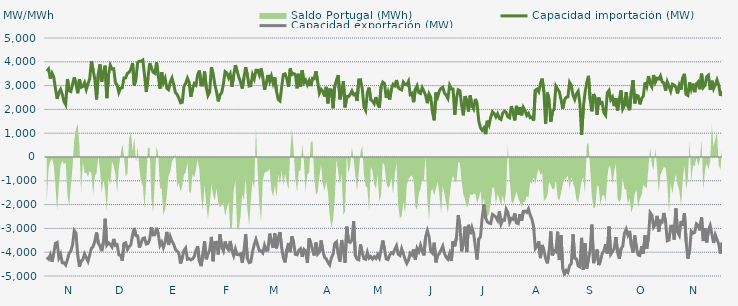
| Category | Capacidad importación (MW) | Capacidad exportación (MW) |
|---|---|---|
| 0 | 3605.625 | -4208.542 |
| 1900-01-01 | 3697.5 | -4290 |
| 1900-01-02 | 3291.25 | -4115.625 |
| 1900-01-03 | 3523.125 | -4398.75 |
| 1900-01-04 | 3371.25 | -4055.625 |
| 1900-01-05 | 2883.75 | -3628.125 |
| 1900-01-06 | 2445 | -3590.625 |
| 1900-01-07 | 2711.25 | -4233.75 |
| 1900-01-08 | 2842.292 | -4080 |
| 1900-01-09 | 2631.042 | -4443.75 |
| 1900-01-10 | 2333.542 | -4443.75 |
| 1900-01-11 | 2201.25 | -4537.5 |
| 1900-01-12 | 3275.625 | -4314.375 |
| 1900-01-13 | 2778.75 | -4038.75 |
| 1900-01-14 | 2749.167 | -3955 |
| 1900-01-15 | 3064.375 | -3696.875 |
| 1900-01-16 | 3341.083 | -3091.583 |
| 1900-01-17 | 3070.042 | -3200 |
| 1900-01-18 | 2678.625 | -4117.917 |
| 1900-01-19 | 3264.375 | -4610.625 |
| 1900-01-20 | 2928.75 | -4363.125 |
| 1900-01-21 | 2966.25 | -4316.25 |
| 1900-01-22 | 3121.875 | -4074.375 |
| 1900-01-23 | 2836.875 | -4230 |
| 1900-01-24 | 3078.75 | -4385.625 |
| 1900-01-25 | 3281.25 | -4121.25 |
| 1900-01-26 | 4027.5 | -3836.25 |
| 1900-01-27 | 3646.875 | -3765 |
| 1900-01-28 | 3256.875 | -3536.25 |
| 1900-01-29 | 2419.833 | -3170.625 |
| 1900-01-30 | 3472.5 | -3611.25 |
| 1900-01-31 | 3890.625 | -3742.5 |
| 1900-02-01 | 3166.875 | -3954.375 |
| 1900-02-02 | 3577.5 | -3583.125 |
| 1900-02-03 | 3836 | -2595.625 |
| 1900-02-04 | 2475 | -3700 |
| 1900-02-05 | 3466.875 | -3605.625 |
| 1900-02-06 | 3856.875 | -3676.458 |
| 1900-02-07 | 3697.5 | -3778.125 |
| 1900-02-08 | 3708.75 | -3440.625 |
| 1900-02-09 | 3125.625 | -3712.5 |
| 1900-02-10 | 3026.792 | -3685.625 |
| 1900-02-11 | 2711.458 | -4111.875 |
| 1900-02-12 | 2894.583 | -4117.5 |
| 1900-02-13 | 2908.583 | -4353.75 |
| 1900-02-14 | 3321.875 | -3639.375 |
| 1900-02-15 | 3324.375 | -3603.75 |
| 1900-02-16 | 3515.833 | -3886.875 |
| 1900-02-17 | 3562.5 | -3763.125 |
| 1900-02-18 | 3684.792 | -3688.125 |
| 1900-02-19 | 3950.625 | -3281.25 |
| 1900-02-20 | 3006.042 | -2979.375 |
| 1900-02-21 | 3276.667 | -3305.625 |
| 1900-02-22 | 3978.75 | -3315 |
| 1900-02-23 | 4018.125 | -3806.25 |
| 1900-02-24 | 4020 | -3611.25 |
| 1900-02-25 | 4072.5 | -3421.458 |
| 1900-02-26 | 3435 | -3400.208 |
| 1900-02-27 | 2733.458 | -3658.125 |
| 1900-02-28 | 3328.542 | -3637.5 |
| 1900-02-28 | 3937.5 | -3451.875 |
| 1900-03-01 | 3746.25 | -2948.958 |
| 1900-03-02 | 3564.375 | -3273.75 |
| 1900-03-03 | 3513.75 | -3266.25 |
| 1900-03-04 | 3975 | -2973.75 |
| 1900-03-05 | 3418.125 | -3228.75 |
| 1900-03-06 | 2868.75 | -3712.5 |
| 1900-03-07 | 3568.125 | -3577.5 |
| 1900-03-08 | 3120 | -3802.5 |
| 1900-03-09 | 3305.625 | -3564.375 |
| 1900-03-10 | 2884.375 | -3145.875 |
| 1900-03-11 | 2826.25 | -3695.625 |
| 1900-03-12 | 3149.792 | -3346.875 |
| 1900-03-13 | 3321.458 | -3540 |
| 1900-03-14 | 3048.75 | -3665.625 |
| 1900-03-15 | 2704.25 | -3881.25 |
| 1900-03-16 | 2627.25 | -3950.625 |
| 1900-03-17 | 2475.708 | -4038.75 |
| 1900-03-18 | 2277.917 | -4477.5 |
| 1900-03-19 | 2300 | -4239.375 |
| 1900-03-20 | 2972.708 | -3928.125 |
| 1900-03-21 | 3093.75 | -3825 |
| 1900-03-22 | 3313.333 | -4297.5 |
| 1900-03-23 | 3141.75 | -4268.125 |
| 1900-03-24 | 2533.125 | -4321.875 |
| 1900-03-25 | 2863.375 | -4282.5 |
| 1900-03-26 | 3088.125 | -4185 |
| 1900-03-27 | 3024.375 | -3931.875 |
| 1900-03-28 | 3459.375 | -3751.875 |
| 1900-03-29 | 3630 | -4380 |
| 1900-03-30 | 3020.625 | -4586.25 |
| 1900-03-31 | 3020.625 | -4091.25 |
| 1900-04-01 | 3592.5 | -3540 |
| 1900-04-02 | 2925 | -4297.5 |
| 1900-04-03 | 2582.625 | -4080.542 |
| 1900-04-04 | 2730 | -3900.625 |
| 1900-04-05 | 3769.167 | -3357.25 |
| 1900-04-06 | 3498.625 | -4380 |
| 1900-04-07 | 3058.125 | -3591.583 |
| 1900-04-08 | 2735.625 | -3581.875 |
| 1900-04-09 | 2339.792 | -4096.875 |
| 1900-04-10 | 2622.625 | -3250.667 |
| 1900-04-11 | 2697.5 | -3770.625 |
| 1900-04-12 | 3064.167 | -3943.625 |
| 1900-04-13 | 3588.75 | -3549.375 |
| 1900-04-14 | 3535.75 | -3810 |
| 1900-04-15 | 3333.958 | -3898.125 |
| 1900-04-16 | 3486.625 | -3530.542 |
| 1900-04-17 | 2951.375 | -3943.125 |
| 1900-04-18 | 3439.375 | -4149.375 |
| 1900-04-19 | 3860.625 | -3864.375 |
| 1900-04-20 | 3609.583 | -4100.625 |
| 1900-04-21 | 3359.75 | -4110 |
| 1900-04-22 | 3152.25 | -4073.75 |
| 1900-04-23 | 2876.25 | -4441.875 |
| 1900-04-24 | 3331.25 | -3948.75 |
| 1900-04-25 | 3768.75 | -3251.25 |
| 1900-04-26 | 3435.667 | -4269.375 |
| 1900-04-27 | 2984.167 | -4438.125 |
| 1900-04-28 | 2998.583 | -4415.625 |
| 1900-04-29 | 3457.333 | -3980.625 |
| 1900-04-30 | 3283.042 | -3676.875 |
| 1900-05-01 | 3641.25 | -3464.5 |
| 1900-05-02 | 3640.708 | -3708.75 |
| 1900-05-03 | 3435.708 | -3937.5 |
| 1900-05-04 | 3718.125 | -3943.125 |
| 1900-05-05 | 3344.458 | -4031.25 |
| 1900-05-06 | 2827.083 | -3710.625 |
| 1900-05-07 | 3113.75 | -3920.625 |
| 1900-05-08 | 3448.125 | -3913.125 |
| 1900-05-09 | 3172.083 | -3219.375 |
| 1900-05-10 | 3397.5 | -3562.5 |
| 1900-05-11 | 3101.042 | -3819.375 |
| 1900-05-12 | 3341.25 | -3215.625 |
| 1900-05-13 | 2760.833 | -3838.125 |
| 1900-05-14 | 2417.5 | -3395.625 |
| 1900-05-15 | 2354.583 | -3155.625 |
| 1900-05-16 | 2936.875 | -3811.875 |
| 1900-05-17 | 3468.75 | -4241.25 |
| 1900-05-18 | 3495 | -4426.875 |
| 1900-05-19 | 3297.083 | -3890.625 |
| 1900-05-20 | 2946.292 | -3613.125 |
| 1900-05-21 | 3714.792 | -3997.5 |
| 1900-05-22 | 3460.833 | -3331.875 |
| 1900-05-23 | 3502.917 | -3618.5 |
| 1900-05-24 | 3472.5 | -4089.375 |
| 1900-05-25 | 2885.87 | -4111.304 |
| 1900-05-26 | 3496.875 | -3930 |
| 1900-05-27 | 2942.5 | -3858.75 |
| 1900-05-28 | 3650.625 | -4194.375 |
| 1900-05-29 | 3122.458 | -3885 |
| 1900-05-30 | 3230.042 | -3961.875 |
| 1900-05-31 | 3034.208 | -4453.125 |
| 1900-06-01 | 3206.25 | -3423.75 |
| 1900-06-02 | 2977.5 | -3611.25 |
| 1900-06-03 | 3309.375 | -3911.25 |
| 1900-06-04 | 3288.75 | -4138.125 |
| 1900-06-05 | 3602.833 | -3596.25 |
| 1900-06-06 | 3174.375 | -4080 |
| 1900-06-07 | 2683.667 | -3991.875 |
| 1900-06-08 | 2848.875 | -3504.833 |
| 1900-06-09 | 2758.542 | -3938.333 |
| 1900-06-10 | 2545.417 | -4209.375 |
| 1900-06-11 | 2945.625 | -4278.75 |
| 1900-06-12 | 2252.5 | -4423.125 |
| 1900-06-13 | 2829.375 | -4533.75 |
| 1900-06-14 | 2820.917 | -4235.625 |
| 1900-06-15 | 2048.125 | -4081.208 |
| 1900-06-16 | 3003.75 | -3632.292 |
| 1900-06-17 | 3232.5 | -3565.625 |
| 1900-06-18 | 3440.625 | -4096.875 |
| 1900-06-19 | 2422.5 | -4393.125 |
| 1900-06-20 | 2763.958 | -3487.5 |
| 1900-06-21 | 3183.75 | -3943.125 |
| 1900-06-22 | 2087.083 | -4443.75 |
| 1900-06-23 | 2547 | -2925.75 |
| 1900-06-24 | 2531.667 | -3560.625 |
| 1900-06-25 | 2628.75 | -3590.625 |
| 1900-06-26 | 2778.75 | -3480 |
| 1900-06-27 | 2617.292 | -2701.792 |
| 1900-06-28 | 2655 | -4141.875 |
| 1900-06-29 | 2355.417 | -4288.125 |
| 1900-06-30 | 3240.75 | -4318.125 |
| 1900-07-01 | 3247.5 | -3676.875 |
| 1900-07-02 | 2878.042 | -4025.625 |
| 1900-07-03 | 2109.167 | -4269.375 |
| 1900-07-04 | 1961.042 | -4299.375 |
| 1900-07-05 | 2710.208 | -4003.125 |
| 1900-07-06 | 2916 | -4248.333 |
| 1900-07-07 | 2401.875 | -4179.375 |
| 1900-07-08 | 2351.25 | -4286.25 |
| 1900-07-09 | 2238.75 | -4192.5 |
| 1900-07-10 | 2520 | -4265.625 |
| 1900-07-11 | 2227.5 | -4108.125 |
| 1900-07-12 | 2070.583 | -4246.875 |
| 1900-07-13 | 2958.75 | -3892.5 |
| 1900-07-14 | 3146.25 | -3508.125 |
| 1900-07-15 | 3087.5 | -3877.5 |
| 1900-07-16 | 2487.5 | -4284.375 |
| 1900-07-17 | 2722.5 | -4310.625 |
| 1900-07-18 | 2411.25 | -4125 |
| 1900-07-19 | 2840.5 | -4025.625 |
| 1900-07-20 | 3054.5 | -4066.875 |
| 1900-07-21 | 2992.958 | -3879.375 |
| 1900-07-22 | 3232.5 | -3729.375 |
| 1900-07-23 | 2917.5 | -4085.625 |
| 1900-07-24 | 2853.75 | -4141.875 |
| 1900-07-25 | 2819.458 | -3849.375 |
| 1900-07-26 | 3145.042 | -4061.25 |
| 1900-07-27 | 3046.958 | -4290 |
| 1900-07-28 | 3028.125 | -4468.125 |
| 1900-07-29 | 3180.542 | -4331.25 |
| 1900-07-30 | 2624.958 | -4042.5 |
| 1900-07-31 | 2676.25 | -4115.625 |
| 1900-08-01 | 2302.5 | -3873.75 |
| 1900-08-02 | 2854.208 | -4308.75 |
| 1900-08-03 | 2997.833 | -3837.167 |
| 1900-08-04 | 2709.375 | -3973.125 |
| 1900-08-05 | 2670 | -3712.958 |
| 1900-08-06 | 2913.75 | -3958.125 |
| 1900-08-07 | 2765.625 | -4134.375 |
| 1900-08-08 | 2587.5 | -3352.5 |
| 1900-08-09 | 2261.25 | -3093.75 |
| 1900-08-10 | 2651.25 | -3345.208 |
| 1900-08-11 | 2510.625 | -3963.75 |
| 1900-08-12 | 1885.875 | -4044.375 |
| 1900-08-13 | 1541.5 | -3601.375 |
| 1900-08-14 | 2707.5 | -4426.875 |
| 1900-08-15 | 2516.25 | -4128.75 |
| 1900-08-16 | 2775 | -4059.375 |
| 1900-08-17 | 2883.75 | -3906.667 |
| 1900-08-18 | 2930.625 | -3742.5 |
| 1900-08-19 | 2685 | -4061.25 |
| 1900-08-20 | 2596.875 | -4213.125 |
| 1900-08-21 | 2463.75 | -4295.625 |
| 1900-08-22 | 3005.625 | -4065 |
| 1900-08-23 | 2861.25 | -4370.625 |
| 1900-08-24 | 2855.083 | -3533.583 |
| 1900-08-25 | 1775.625 | -3751.875 |
| 1900-08-26 | 2478.75 | -3391.875 |
| 1900-08-27 | 2821.875 | -2444.375 |
| 1900-08-28 | 2782.5 | -2903.75 |
| 1900-08-29 | 2169.375 | -3964.667 |
| 1900-08-30 | 1751.292 | -3614.625 |
| 1900-08-31 | 2561.25 | -2926.875 |
| 1900-09-01 | 2356.875 | -3995.625 |
| 1900-09-02 | 1911.125 | -2849.625 |
| 1900-09-03 | 2583.75 | -3240 |
| 1900-09-04 | 2157.125 | -2962.917 |
| 1900-09-05 | 2021.375 | -3195.625 |
| 1900-09-06 | 2439.375 | -3776.25 |
| 1900-09-07 | 2235 | -4305 |
| 1900-09-08 | 1509.375 | -3436.875 |
| 1900-09-09 | 1230.208 | -3360 |
| 1900-09-10 | 1123.125 | -2546.875 |
| 1900-09-11 | 1221.25 | -1995.875 |
| 1900-09-12 | 962.083 | -2563.125 |
| 1900-09-13 | 1523.958 | -2728.125 |
| 1900-09-14 | 1344.375 | -2776.875 |
| 1900-09-15 | 1676.25 | -2795.625 |
| 1900-09-16 | 1899.375 | -2411.25 |
| 1900-09-17 | 1826.25 | -2461.875 |
| 1900-09-18 | 1680 | -2529.375 |
| 1900-09-19 | 1815 | -2662.5 |
| 1900-09-20 | 1621.458 | -2287.5 |
| 1900-09-21 | 1577.083 | -2818.125 |
| 1900-09-22 | 1846.875 | -2643.75 |
| 1900-09-23 | 1923.75 | -2656.875 |
| 1900-09-24 | 1875 | -2195.625 |
| 1900-09-25 | 1683.75 | -2330.625 |
| 1900-09-26 | 1646.25 | -2746.875 |
| 1900-09-27 | 2137.5 | -2580.5 |
| 1900-09-28 | 1860 | -2620.625 |
| 1900-09-29 | 1537.5 | -2371.875 |
| 1900-09-30 | 2149.292 | -2771.25 |
| 1900-10-01 | 1766.25 | -2801.25 |
| 1900-10-02 | 2097.75 | -2405.625 |
| 1900-10-03 | 1753.125 | -2676.75 |
| 1900-10-04 | 2090.625 | -2285.292 |
| 1900-10-05 | 1956.125 | -2274.75 |
| 1900-10-06 | 1743.75 | -2330.125 |
| 1900-10-07 | 1833.75 | -2185.875 |
| 1900-10-08 | 1651.875 | -2439.375 |
| 1900-10-09 | 1677 | -2608.125 |
| 1900-10-10 | 1526.25 | -2926.875 |
| 1900-10-11 | 2806.875 | -3847.5 |
| 1900-10-12 | 2853.75 | -3770.625 |
| 1900-10-13 | 2739.375 | -3542.5 |
| 1900-10-14 | 3086.25 | -4248.75 |
| 1900-10-15 | 3294.375 | -3694.583 |
| 1900-10-16 | 2737.5 | -3914.167 |
| 1900-10-17 | 1388.958 | -4258.125 |
| 1900-10-18 | 2705.625 | -4468.125 |
| 1900-10-19 | 2414.25 | -4032.292 |
| 1900-10-20 | 1474.5 | -3127.5 |
| 1900-10-21 | 1904.833 | -4134.375 |
| 1900-10-22 | 2018.333 | -3933.75 |
| 1900-10-23 | 2978.625 | -3980.625 |
| 1900-10-24 | 2851.875 | -3137.917 |
| 1900-10-25 | 2745 | -4327.5 |
| 1900-10-26 | 2411.25 | -3294.375 |
| 1900-10-27 | 2032.5 | -4693.125 |
| 1900-10-28 | 2394.375 | -4916.25 |
| 1900-10-29 | 2506.875 | -4770 |
| 1900-10-30 | 2527.5 | -4845 |
| 1900-10-31 | 3132.875 | -4556.25 |
| 1900-11-01 | 3001.875 | -4479.375 |
| 1900-11-02 | 2597 | -3253.75 |
| 1900-11-03 | 2415.833 | -4258.125 |
| 1900-11-04 | 2655 | -4284.375 |
| 1900-11-05 | 2764.458 | -4576.875 |
| 1900-11-06 | 2248.625 | -4616.25 |
| 1900-11-07 | 931.875 | -3396.042 |
| 1900-11-08 | 2074.792 | -4740 |
| 1900-11-09 | 2707.5 | -3624.375 |
| 1900-11-10 | 3118.125 | -4681.875 |
| 1900-11-11 | 3408.75 | -4280.625 |
| 1900-11-12 | 2415 | -3889.583 |
| 1900-11-13 | 1918.917 | -2840.25 |
| 1900-11-14 | 2645.125 | -4460.625 |
| 1900-11-15 | 2469.792 | -4186.875 |
| 1900-11-16 | 1772.542 | -3887.917 |
| 1900-11-17 | 2498.667 | -4538.125 |
| 1900-11-18 | 2245.542 | -4370 |
| 1900-11-19 | 2285.625 | -4056.25 |
| 1900-11-20 | 1862.708 | -3941.667 |
| 1900-11-21 | 1755.417 | -3663.125 |
| 1900-11-22 | 2699.583 | -4063.125 |
| 1900-11-23 | 2797.5 | -2925.625 |
| 1900-11-24 | 2403.333 | -4085.625 |
| 1900-11-25 | 2516.25 | -3971.25 |
| 1900-11-26 | 2135.625 | -3854.792 |
| 1900-11-27 | 2477.125 | -3369.292 |
| 1900-11-28 | 1956.292 | -3999.375 |
| 1900-11-29 | 2427.5 | -4280 |
| 1900-11-30 | 2798 | -3856.875 |
| 1900-12-01 | 2018.125 | -3744.583 |
| 1900-12-02 | 2168.958 | -3208.75 |
| 1900-12-03 | 2728.125 | -3034.375 |
| 1900-12-04 | 2131.75 | -3278.125 |
| 1900-12-05 | 1966.875 | -3106.458 |
| 1900-12-06 | 2738.083 | -3703.375 |
| 1900-12-07 | 3229.167 | -4012.5 |
| 1900-12-08 | 2249.792 | -3300.833 |
| 1900-12-09 | 2592.917 | -3809.792 |
| 1900-12-10 | 2566.25 | -4116.667 |
| 1900-12-11 | 2212.5 | -4138.708 |
| 1900-12-12 | 2464.375 | -3755.833 |
| 1900-12-13 | 2551.042 | -4061.25 |
| 1900-12-14 | 3133.5 | -3295.833 |
| 1900-12-15 | 2953.75 | -3854.167 |
| 1900-12-16 | 3401.25 | -3375.917 |
| 1900-12-17 | 3082.5 | -2336.25 |
| 1900-12-18 | 2949.375 | -2439.375 |
| 1900-12-19 | 3446.25 | -2947.5 |
| 1900-12-20 | 3138.75 | -2840.625 |
| 1900-12-21 | 3305 | -2472.958 |
| 1900-12-22 | 3276.125 | -3134.625 |
| 1900-12-23 | 3410.625 | -2685.417 |
| 1900-12-24 | 3153.75 | -2727.292 |
| 1900-12-25 | 3110.625 | -2351.25 |
| 1900-12-26 | 2786.458 | -2737.5 |
| 1900-12-27 | 3159.375 | -3519.375 |
| 1900-12-28 | 2974.6 | -3488.4 |
| 1900-12-29 | 2766.667 | -2906.917 |
| 1900-12-30 | 3058.125 | -2902.5 |
| 1900-12-31 | 3018.75 | -3474.375 |
| 1901-01-01 | 2925.625 | -2158.375 |
| 1901-01-02 | 2670.667 | -3157.5 |
| 1901-01-03 | 3015 | -3296.25 |
| 1901-01-04 | 2835.25 | -2693.125 |
| 1901-01-05 | 3337.5 | -2882.083 |
| 1901-01-06 | 3493.125 | -2358.75 |
| 1901-01-07 | 2626.042 | -3555 |
| 1901-01-08 | 2583.542 | -4267.5 |
| 1901-01-09 | 3140.625 | -3948.75 |
| 1901-01-10 | 2844.375 | -3122.5 |
| 1901-01-11 | 3082.5 | -3200.625 |
| 1901-01-12 | 2726.25 | -3170.625 |
| 1901-01-13 | 3071.25 | -2806.875 |
| 1901-01-14 | 3151.875 | -2865 |
| 1901-01-15 | 2845.417 | -3084.375 |
| 1901-01-16 | 3500.625 | -2536.875 |
| 1901-01-17 | 2921.75 | -3531.625 |
| 1901-01-18 | 3012.625 | -2985.75 |
| 1901-01-19 | 3378.75 | -3590.625 |
| 1901-01-20 | 3442.5 | -3078.75 |
| 1901-01-21 | 2829.167 | -2881.042 |
| 1901-01-22 | 3205.833 | -3234.375 |
| 1901-01-23 | 2873.625 | -3613.125 |
| 1901-01-24 | 3038.333 | -3270 |
| 1901-01-25 | 3245.625 | -3459.375 |
| 1901-01-26 | 3029.167 | -3656.25 |
| 1901-01-27 | 2571.042 | -4057.5 |
| 1901-01-28 | 2766.125 | -3596.417 |